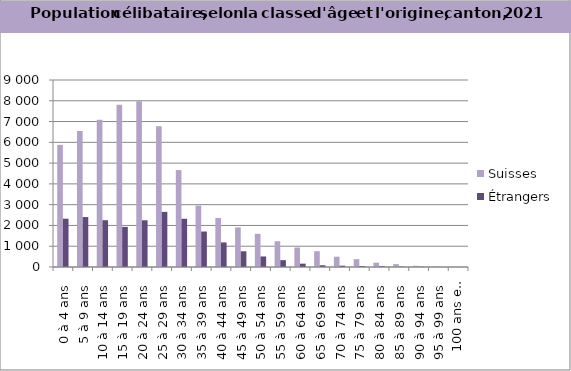
| Category | Suisses | Étrangers |
|---|---|---|
| 0 à 4 ans | 5879 | 2324 |
| 5 à 9 ans | 6548 | 2404 |
| 10 à 14 ans | 7083 | 2253 |
| 15 à 19 ans | 7812 | 1930 |
| 20 à 24 ans | 7982 | 2249 |
| 25 à 29 ans | 6771 | 2653 |
| 30 à 34 ans | 4665 | 2322 |
| 35 à 39 ans | 2954 | 1707 |
| 40 à 44 ans | 2358 | 1183 |
| 45 à 49 ans | 1906 | 757 |
| 50 à 54 ans | 1597 | 507 |
| 55 à 59 ans | 1240 | 329 |
| 60 à 64 ans | 938 | 161 |
| 65 à 69 ans | 761 | 85 |
| 70 à 74 ans | 495 | 63 |
| 75 à 79 ans | 379 | 44 |
| 80 à 84 ans | 209 | 35 |
| 85 à 89 ans | 137 | 22 |
| 90 à 94 ans | 58 | 13 |
| 95 à 99 ans | 25 | 2 |
| 100 ans et plus | 1 | 0 |